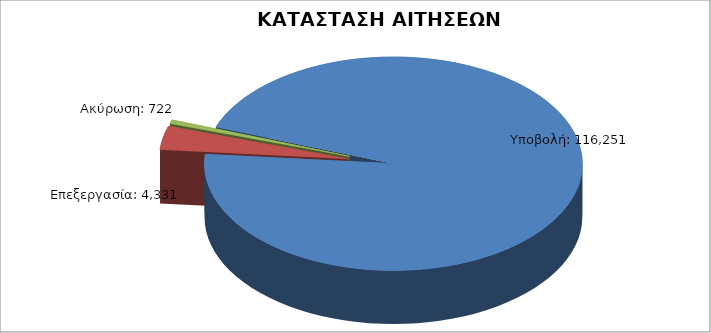
| Category | Series 0 |
|---|---|
| Υποβολή: | 116251 |
| Επεξεργασία: | 4331 |
| Ακύρωση: | 722 |